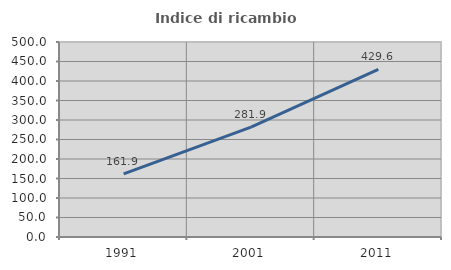
| Category | Indice di ricambio occupazionale  |
|---|---|
| 1991.0 | 161.851 |
| 2001.0 | 281.877 |
| 2011.0 | 429.615 |